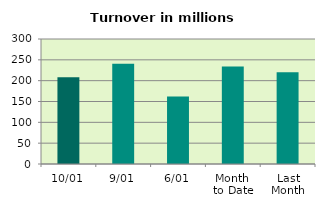
| Category | Series 0 |
|---|---|
| 10/01 | 208.227 |
| 9/01 | 240.697 |
| 6/01 | 162.242 |
| Month 
to Date | 234.264 |
| Last
Month | 219.947 |